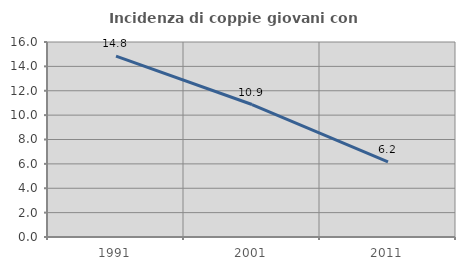
| Category | Incidenza di coppie giovani con figli |
|---|---|
| 1991.0 | 14.835 |
| 2001.0 | 10.87 |
| 2011.0 | 6.156 |